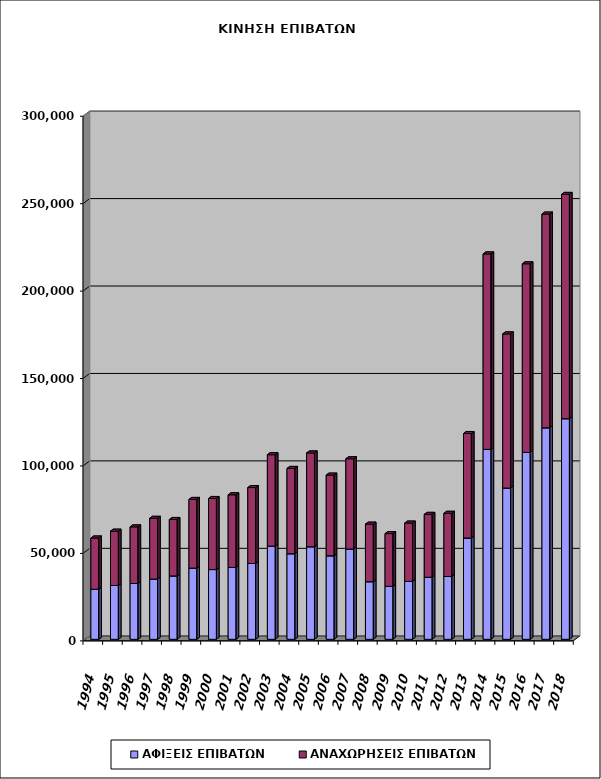
| Category | ΑΦΙΞΕΙΣ ΕΠΙΒΑΤΩΝ | ΑΝΑΧΩΡΗΣΕΙΣ ΕΠΙΒΑΤΩΝ |
|---|---|---|
| 1994.0 | 28654 | 29285 |
| 1995.0 | 30793 | 31053 |
| 1996.0 | 31936 | 32367 |
| 1997.0 | 34454 | 34737 |
| 1998.0 | 36249 | 32286 |
| 1999.0 | 40723 | 39279 |
| 2000.0 | 39900 | 40633 |
| 2001.0 | 41119 | 41505 |
| 2002.0 | 43383 | 43398 |
| 2003.0 | 53280 | 52279 |
| 2004.0 | 48949 | 48774 |
| 2005.0 | 52931 | 53644 |
| 2006.0 | 47767 | 46141 |
| 2007.0 | 51641 | 51616 |
| 2008.0 | 32950 | 32910 |
| 2009.0 | 30272 | 30187 |
| 2010.0 | 33144 | 33338 |
| 2011.0 | 35502 | 35950 |
| 2012.0 | 35948 | 36114 |
| 2013.0 | 57947 | 59736 |
| 2014.0 | 108623 | 111751 |
| 2015.0 | 86508 | 88159 |
| 2016.0 | 106921 | 107827 |
| 2017.0 | 120968 | 122192 |
| 2018.0 | 126162 | 128256 |